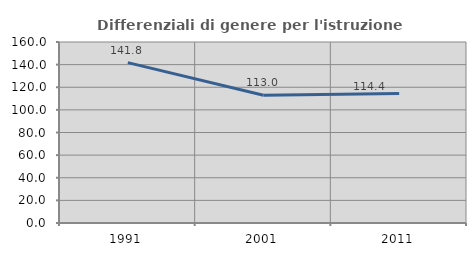
| Category | Differenziali di genere per l'istruzione superiore |
|---|---|
| 1991.0 | 141.774 |
| 2001.0 | 112.995 |
| 2011.0 | 114.432 |